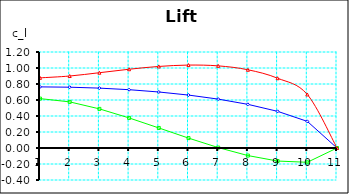
| Category | Series 0 | Series 1 | Series 2 |
|---|---|---|---|
| 0 | 0.764 | 0.617 | 0.877 |
| 1 | 0.76 | 0.577 | 0.9 |
| 2 | 0.749 | 0.489 | 0.941 |
| 3 | 0.729 | 0.376 | 0.985 |
| 4 | 0.7 | 0.251 | 1.019 |
| 5 | 0.662 | 0.124 | 1.037 |
| 6 | 0.611 | 0.005 | 1.027 |
| 7 | 0.546 | -0.095 | 0.978 |
| 8 | 0.458 | -0.163 | 0.872 |
| 9 | 0.333 | -0.179 | 0.669 |
| 10 | 0 | 0 | 0 |